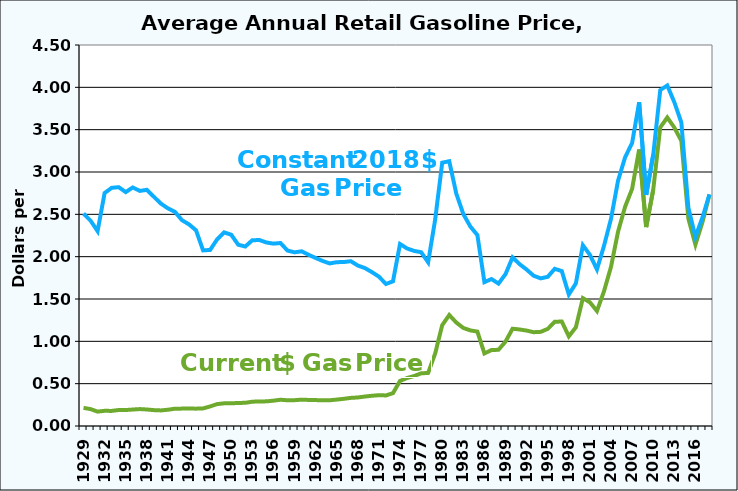
| Category | Series 0 | Series 1 |
|---|---|---|
| 1929.0 | 0.214 | 2.509 |
| 1930.0 | 0.199 | 2.426 |
| 1931.0 | 0.17 | 2.301 |
| 1932.0 | 0.179 | 2.751 |
| 1933.0 | 0.178 | 2.813 |
| 1934.0 | 0.188 | 2.821 |
| 1935.0 | 0.188 | 2.762 |
| 1936.0 | 0.194 | 2.817 |
| 1937.0 | 0.2 | 2.777 |
| 1938.0 | 0.195 | 2.79 |
| 1939.0 | 0.188 | 2.708 |
| 1940.0 | 0.184 | 2.627 |
| 1941.0 | 0.192 | 2.57 |
| 1942.0 | 0.204 | 2.53 |
| 1943.0 | 0.205 | 2.431 |
| 1944.0 | 0.206 | 2.381 |
| 1945.0 | 0.205 | 2.311 |
| 1946.0 | 0.208 | 2.074 |
| 1947.0 | 0.231 | 2.08 |
| 1948.0 | 0.259 | 2.205 |
| 1949.0 | 0.268 | 2.287 |
| 1950.0 | 0.268 | 2.259 |
| 1951.0 | 0.272 | 2.141 |
| 1952.0 | 0.274 | 2.12 |
| 1953.0 | 0.287 | 2.194 |
| 1954.0 | 0.29 | 2.197 |
| 1955.0 | 0.291 | 2.168 |
| 1956.0 | 0.299 | 2.154 |
| 1957.0 | 0.31 | 2.161 |
| 1958.0 | 0.304 | 2.072 |
| 1959.0 | 0.305 | 2.051 |
| 1960.0 | 0.311 | 2.063 |
| 1961.0 | 0.308 | 2.022 |
| 1962.0 | 0.306 | 1.985 |
| 1963.0 | 0.304 | 1.949 |
| 1964.0 | 0.304 | 1.92 |
| 1965.0 | 0.312 | 1.935 |
| 1966.0 | 0.321 | 1.937 |
| 1967.0 | 0.332 | 1.947 |
| 1968.0 | 0.337 | 1.895 |
| 1969.0 | 0.348 | 1.866 |
| 1970.0 | 0.357 | 1.818 |
| 1971.0 | 0.364 | 1.764 |
| 1972.0 | 0.361 | 1.677 |
| 1973.0 | 0.388 | 1.709 |
| 1974.0 | 0.532 | 2.15 |
| 1975.0 | 0.567 | 2.097 |
| 1976.0 | 0.59 | 2.068 |
| 1977.0 | 0.622 | 2.053 |
| 1978.0 | 0.627 | 1.933 |
| 1979.0 | 0.857 | 2.44 |
| 1980.0 | 1.191 | 3.11 |
| 1981.0 | 1.311 | 3.127 |
| 1982.0 | 1.222 | 2.745 |
| 1983.0 | 1.158 | 2.504 |
| 1984.0 | 1.129 | 2.356 |
| 1985.0 | 1.115 | 2.255 |
| 1986.0 | 0.857 | 1.699 |
| 1987.0 | 0.897 | 1.736 |
| 1988.0 | 0.9 | 1.682 |
| 1989.0 | 0.997 | 1.793 |
| 1990.0 | 1.149 | 1.992 |
| 1991.0 | 1.14 | 1.912 |
| 1992.0 | 1.127 | 1.848 |
| 1993.0 | 1.108 | 1.775 |
| 1994.0 | 1.112 | 1.744 |
| 1995.0 | 1.147 | 1.762 |
| 1996.0 | 1.231 | 1.857 |
| 1997.0 | 1.234 | 1.83 |
| 1998.0 | 1.059 | 1.553 |
| 1999.0 | 1.165 | 1.684 |
| 2000.0 | 1.51 | 2.135 |
| 2001.0 | 1.461 | 2.021 |
| 2002.0 | 1.358 | 1.849 |
| 2003.0 | 1.591 | 2.127 |
| 2004.0 | 1.88 | 2.448 |
| 2005.0 | 2.295 | 2.898 |
| 2006.0 | 2.589 | 3.173 |
| 2007.0 | 2.801 | 3.343 |
| 2008.0 | 3.266 | 3.824 |
| 2009.0 | 2.35 | 2.73 |
| 2010.0 | 2.788 | 3.202 |
| 2011.0 | 3.527 | 3.968 |
| 2012.0 | 3.644 | 4.022 |
| 2013.0 | 3.526 | 3.825 |
| 2014.0 | 3.367 | 3.585 |
| 2015.0 | 2.448 | 2.579 |
| 2016.0 | 2.142 | 2.232 |
| 2017.0 | 2.408 | 2.462 |
| 2018.0 | 2.735 | 2.735 |